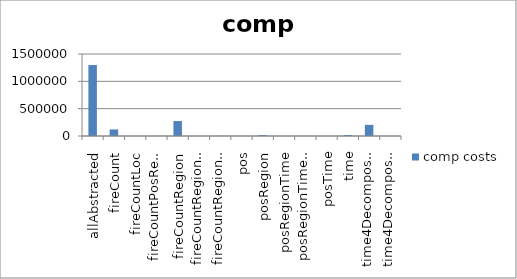
| Category | comp costs |
|---|---|
| allAbstracted | 1297370.301 |
| fireCount | 120247.286 |
| fireCountLoc | 107.886 |
| fireCountPosRegion | 1570.336 |
| fireCountRegion | 273688.594 |
| fireCountRegionLoc | 182.859 |
| fireCountRegionPosRegion | 3900.566 |
| pos | 991.112 |
| posRegion | 15806.665 |
| posRegionTime | 271.063 |
| posRegionTime4Decomposed | 2837.469 |
| posTime | 20.613 |
| time | 17261.956 |
| time4Decomposed | 204042.484 |
| time4DecomposedLoc | 217.535 |